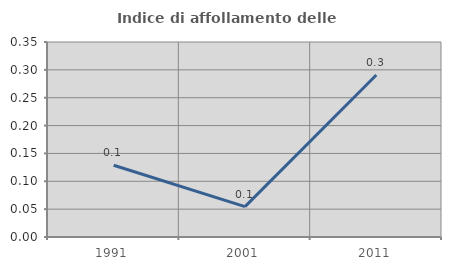
| Category | Indice di affollamento delle abitazioni  |
|---|---|
| 1991.0 | 0.129 |
| 2001.0 | 0.055 |
| 2011.0 | 0.291 |